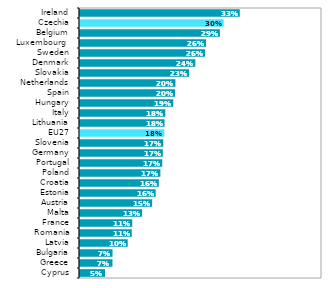
| Category | Series 0 |
|---|---|
| Cyprus | 0.054 |
| Greece | 0.069 |
| Bulgaria | 0.069 |
| Latvia | 0.101 |
| Romania | 0.109 |
| France | 0.11 |
| Malta | 0.13 |
| Austria | 0.151 |
| Estonia | 0.158 |
| Croatia | 0.165 |
| Poland | 0.168 |
| Portugal | 0.172 |
| Germany | 0.173 |
| Slovenia | 0.174 |
| EU27 | 0.176 |
| Lithuania | 0.177 |
| Italy | 0.178 |
| Hungary | 0.195 |
| Spain | 0.199 |
| Netherlands | 0.199 |
| Slovakia | 0.227 |
| Denmark | 0.24 |
| Sweden | 0.26 |
| Luxembourg  | 0.263 |
| Belgium | 0.291 |
| Czechia | 0.299 |
| Ireland | 0.332 |